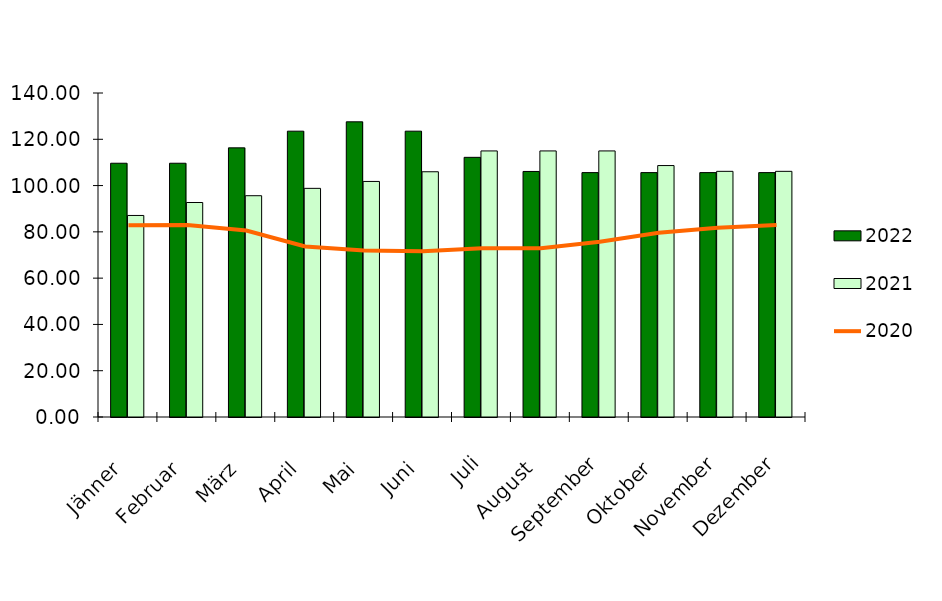
| Category | 2022 | 2021 |
|---|---|---|
| Jänner | 109.65 | 87.083 |
| Februar | 109.65 | 92.683 |
| März | 116.3 | 95.617 |
| April | 123.5 | 98.8 |
| Mai | 127.55 | 101.783 |
| Juni | 123.5 | 105.967 |
| Juli | 112.2 | 114.967 |
| August | 106.1 | 114.967 |
| September | 105.6 | 114.967 |
| Oktober | 105.6 | 108.65 |
| November | 105.6 | 106.15 |
| Dezember | 105.6 | 106.15 |